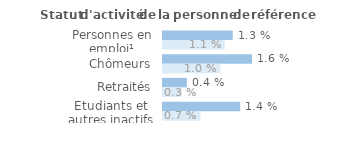
| Category | Series 1 | Series 0 |
|---|---|---|
| Personnes en emploi¹ | 0.013 | 0.011 |
| Chômeurs | 0.016 | 0.01 |
| Retraités | 0.004 | 0.003 |
| Etudiants et autres inactifs | 0.014 | 0.007 |